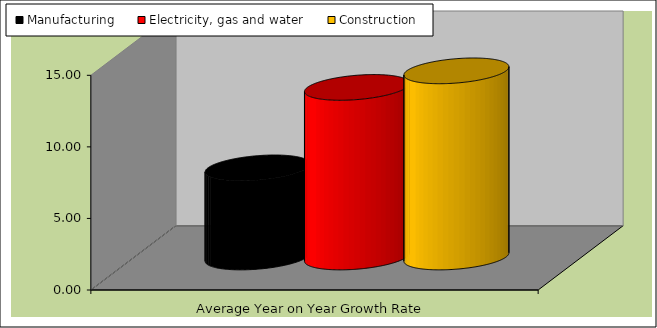
| Category | Manufacturing | Electricity, gas and water | Construction |
|---|---|---|---|
| Average Year on Year Growth Rate | 6.227 | 11.849 | 13.006 |